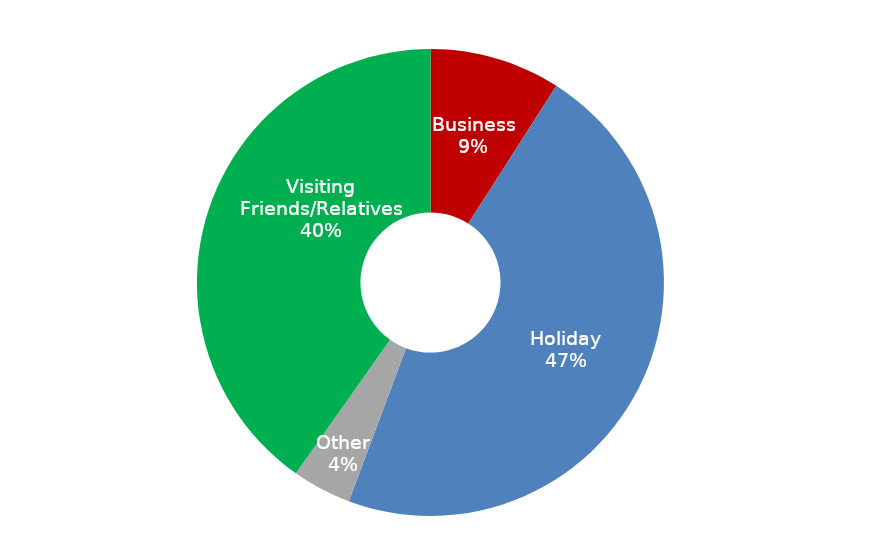
| Category | July 2016 - June 2017 |
|---|---|
| Business | 432604.024 |
| Holiday | 2226320.398 |
| Other | 195592.782 |
| Visiting Friends/Relatives | 1920513.47 |